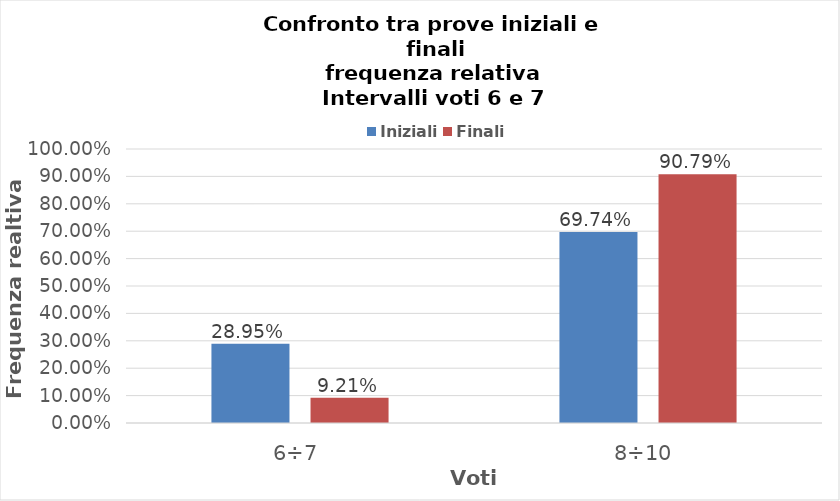
| Category | Iniziali | Finali |
|---|---|---|
| 6÷7 | 0.289 | 0.092 |
| 8÷10 | 0.697 | 0.908 |